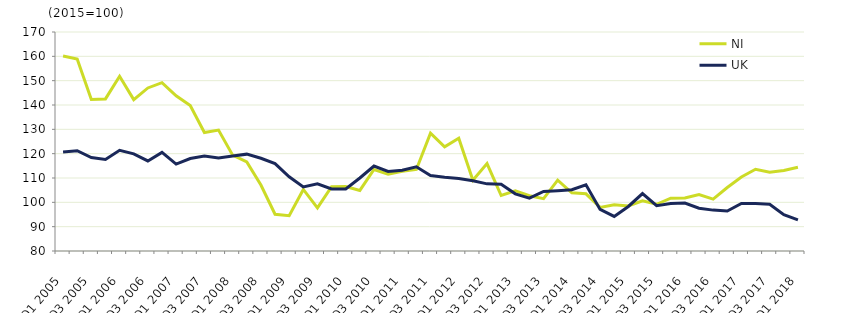
| Category | NI  | UK  |
|---|---|---|
| Q1 2005 | 160.1 | 120.7 |
|  | 158.9 | 121.2 |
| Q3 2005 | 142.3 | 118.4 |
|  | 142.5 | 117.6 |
| Q1 2006 | 151.8 | 121.4 |
|  | 142.2 | 119.9 |
| Q3 2006 | 147 | 117 |
|  | 149.2 | 120.5 |
| Q1 2007 | 143.8 | 115.7 |
|  | 139.8 | 118 |
| Q3 2007 | 128.7 | 119 |
|  | 129.7 | 118.2 |
| Q1 2008 | 119.4 | 119 |
|  | 116.6 | 119.8 |
| Q3 2008 | 107.1 | 118.1 |
|  | 95.1 | 115.9 |
| Q1 2009 | 94.5 | 110.5 |
|  | 105.3 | 106.3 |
| Q3 2009 | 97.7 | 107.6 |
|  | 106.4 | 105.5 |
| Q1 2010 | 106.5 | 105.5 |
|  | 104.9 | 110 |
| Q3 2010 | 113.5 | 114.9 |
|  | 111.6 | 112.7 |
| Q1 2011 | 112.8 | 113.2 |
|  | 113.5 | 114.6 |
| Q3 2011 | 128.4 | 111 |
|  | 122.8 | 110.3 |
| Q1 2012 | 126.3 | 109.8 |
|  | 109.1 | 108.9 |
| Q3 2012 | 115.9 | 107.6 |
|  | 102.8 | 107.4 |
| Q1 2013 | 104.7 | 103.5 |
|  | 102.7 | 101.7 |
| Q3 2013 | 101.5 | 104.5 |
|  | 109.1 | 104.8 |
| Q1 2014 | 103.9 | 105.2 |
|  | 103.5 | 107.2 |
| Q3 2014 | 97.9 | 97.1 |
|  | 99 | 94.2 |
| Q1 2015 | 98.5 | 98.3 |
|  | 100.6 | 103.6 |
| Q3 2015 | 99.2 | 98.6 |
|  | 101.7 | 99.5 |
| Q1 2016 | 101.8 | 99.7 |
|  | 103.2 | 97.6 |
| Q3 2016 | 101.3 | 96.8 |
|  | 106.1 | 96.4 |
| Q1 2017 | 110.4 | 99.5 |
|  | 113.6 | 99.5 |
| Q3 2017 | 112.4 | 99.2 |
|  | 113.1 | 94.9 |
| Q1 2018 | 114.4 | 92.8 |